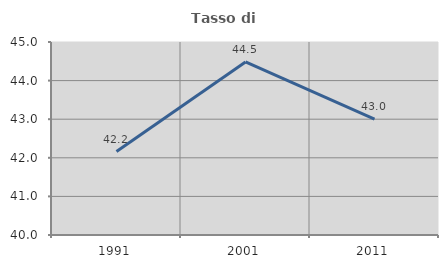
| Category | Tasso di occupazione   |
|---|---|
| 1991.0 | 42.161 |
| 2001.0 | 44.484 |
| 2011.0 | 43.003 |